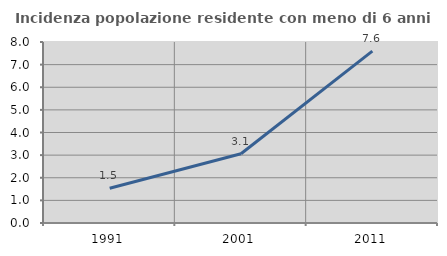
| Category | Incidenza popolazione residente con meno di 6 anni |
|---|---|
| 1991.0 | 1.538 |
| 2001.0 | 3.061 |
| 2011.0 | 7.595 |